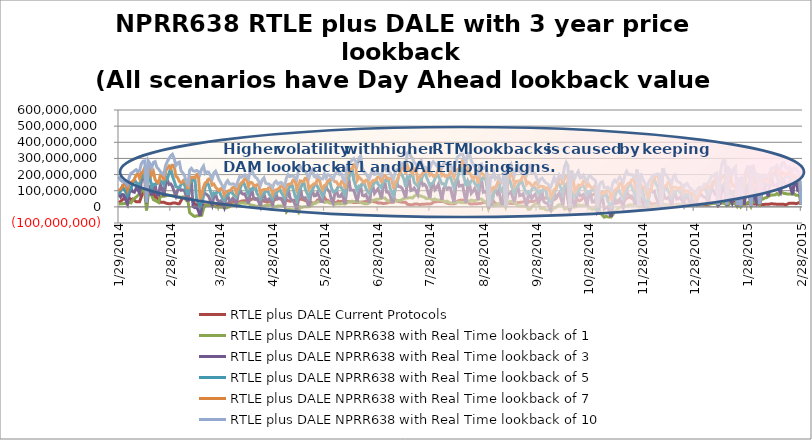
| Category | RTLE plus DALE Current Protocols | RTLE plus DALE NPRR638 with Real Time lookback of 1 | RTLE plus DALE NPRR638 with Real Time lookback of 3 | RTLE plus DALE NPRR638 with Real Time lookback of 5 | RTLE plus DALE NPRR638 with Real Time lookback of 7 | RTLE plus DALE NPRR638 with Real Time lookback of 10 |
|---|---|---|---|---|---|---|
| 1/29/14 | 26165652.225 | 17709287.253 | 76527592.9 | 76527592.9 | 101806723.448 | 188089786.375 |
| 1/30/14 | 33951592.112 | 18653802.654 | 61312578.058 | 97719446.167 | 109309679.373 | 165655656.982 |
| 1/31/14 | 43045783.01 | 18659278.401 | 76535131.416 | 125818531.343 | 125818531.343 | 157568515.088 |
| 2/1/14 | 54769080.035 | 20715354.196 | 74072259.88 | 110485111.069 | 141496596.19 | 160454626.414 |
| 2/2/14 | 54769080.035 | 19008503.449 | 41436894.702 | 92922000.17 | 136304542.49 | 147034414.108 |
| 2/3/14 | 54769080.035 | 17739152.64 | 17739152.64 | 69450591.695 | 104555443.125 | 134499430.953 |
| 2/4/14 | 54867904.896 | 26996020.267 | 86439733.595 | 99383187.698 | 146697169.046 | 183228840.895 |
| 2/5/14 | 44459964.79 | 24640817.867 | 113193286.391 | 113193286.391 | 151588242.612 | 207764552.472 |
| 2/6/14 | 48889341.468 | 41693185.982 | 94130071.633 | 146137356.395 | 157860503.523 | 213699274.897 |
| 2/7/14 | 39654347.796 | 50976492.36 | 90962221.877 | 169441738.78 | 169441738.78 | 223208714.813 |
| 2/8/14 | 32006154.249 | 60986309.439 | 114560262.93 | 150860091.411 | 196704959.607 | 230338929.282 |
| 2/9/14 | 32006154.249 | 71000199.81 | 108119589.093 | 140247632.815 | 208488368.895 | 218915800.982 |
| 2/10/14 | 32006154.249 | 85072667.007 | 85072667.007 | 140125780.146 | 176994774.496 | 223304887.273 |
| 2/11/14 | 63028979.82 | 100295642.93 | 158782564.051 | 183102307.407 | 209592567.887 | 266167044.328 |
| 2/12/14 | 85547610.904 | 105230691.051 | 183422167.297 | 183422167.297 | 217544858.153 | 282534156.366 |
| 2/13/14 | 85937272.747 | 87201054.15 | 178205704.075 | 226273932.53 | 245377253.608 | 284648077.673 |
| 2/14/14 | 97417042.342 | -22335133.928 | 22534531.316 | 28282402.028 | 28282402.028 | 29047897.517 |
| 2/15/14 | 109654336.546 | 84837511.407 | 131226220.664 | 213657866.2 | 257050555.52 | 285771771.665 |
| 2/16/14 | 109654336.546 | 79142358.955 | 102462712.479 | 186651220.536 | 249799873.317 | 267277767.718 |
| 2/17/14 | 109654336.546 | 70845363.688 | 70845363.688 | 116434067.223 | 198258303.201 | 240964313.82 |
| 2/18/14 | 84640835.996 | 44754554.29 | 125687111.653 | 140212324.171 | 218506688.552 | 275014636.427 |
| 2/19/14 | 60344140.354 | 39497830.886 | 137329698.341 | 137329698.341 | 168399234.777 | 279929560.01 |
| 2/20/14 | 56842811.04 | 33716680.02 | 74110660.754 | 143642216.904 | 155886347.871 | 245601132.791 |
| 2/21/14 | 42485541.507 | 27210426.427 | 72381414.646 | 150307200.859 | 150307200.859 | 233830278.512 |
| 2/22/14 | 29104966.55 | 63950706.037 | 136602765.839 | 163046621.836 | 197796989.606 | 218635904.587 |
| 2/23/14 | 29104966.55 | 66006563.571 | 113088367.193 | 152083500.633 | 198985782.158 | 208490308.816 |
| 2/24/14 | 29104966.55 | 66097541.981 | 66097541.981 | 138367962.208 | 164636623.605 | 199076760.569 |
| 2/25/14 | 23864162.506 | 66615520.105 | 139460698.059 | 184000649.46 | 220155639.303 | 253940640.898 |
| 2/26/14 | 21068769.319 | 73076635.477 | 170702604.297 | 170702604.297 | 238823744.066 | 279756654.55 |
| 2/27/14 | 19355877.946 | 71498645.075 | 138387855.373 | 207959124.748 | 252181724.337 | 297818695.257 |
| 2/28/14 | 18802534.063 | 70265512.929 | 141970338.429 | 237689915.909 | 237689915.909 | 316659409.717 |
| 3/1/14 | 23128178.094 | 69620016.794 | 127572795.629 | 190825734.451 | 257641267.301 | 325379782.884 |
| 3/2/14 | 23128178.094 | 67540550.28 | 94173003.259 | 162430371.131 | 255807288.342 | 299715739.648 |
| 3/3/14 | 23128178.094 | 67599775.887 | 67599775.887 | 125681001.986 | 188972353.953 | 255866513.949 |
| 3/4/14 | 19411967.958 | 59506239.3 | 102268470.472 | 120881425.753 | 181237604.015 | 271819591.803 |
| 3/5/14 | 19581333.766 | 61716591.477 | 119494683.443 | 119494683.443 | 158297652.82 | 277098895.521 |
| 3/6/14 | 38369816.469 | 56825881.012 | 102716789.31 | 137245499.368 | 148510825.665 | 223375424.219 |
| 3/7/14 | 57550185.653 | 62287524.069 | 104776584.4 | 155211900.196 | 155211900.196 | 210802070.934 |
| 3/8/14 | 56044264.844 | 61399121.606 | 100457782.079 | 138169468.996 | 167728597.58 | 194974462.755 |
| 3/9/14 | 56044264.844 | 40943787.641 | 66589721.18 | 100932791.755 | 147189641.505 | 156484855.25 |
| 3/10/14 | 56044264.844 | 34346102.833 | 34346102.833 | 73007319.416 | 110682996.29 | 140290128.221 |
| 3/11/14 | 50786282.858 | -36725406.366 | 138170038.726 | 157576173.432 | 185825476.361 | 227828474.122 |
| 3/12/14 | 52394012.107 | -45056064.166 | 154439556.633 | 154439556.633 | 182453392.453 | 238906748.071 |
| 3/13/14 | 35279158.185 | -54186648.793 | 1806001.055 | 165322085.999 | 183215743.042 | 223148540.477 |
| 3/14/14 | 16658128.226 | -59525980.209 | -4785017.409 | 178800425.434 | 178800425.434 | 220766094.933 |
| 3/15/14 | 13706829.115 | -55626885.368 | 752281.98 | 45993144.131 | 199907123.679 | 225595592.77 |
| 3/16/14 | 13706829.115 | -54914396.875 | -23352876.04 | 24442591.043 | 202411629.334 | 219681092.417 |
| 3/17/14 | 13706829.115 | -54515430.118 | -54515430.118 | 2152884.422 | 47609554.761 | 201942040.59 |
| 3/18/14 | 10367868.111 | -52120150.415 | 6893978.967 | 31165773.641 | 74864959.043 | 235799588.592 |
| 3/19/14 | 12220663.599 | -10489755.104 | 77079112.652 | 77079112.652 | 122149908.54 | 252311666.441 |
| 3/20/14 | 12280244.26 | 7612186.475 | 82279569.986 | 126019128.44 | 148501964.908 | 207872705.284 |
| 3/21/14 | 11383137.771 | 9667656.602 | 75029828.068 | 154005698.506 | 154005698.506 | 216808657.101 |
| 3/22/14 | 12942133.313 | 10197977.795 | 65097892.375 | 136037969.859 | 172565832.351 | 214758018.138 |
| 3/23/14 | 12942133.313 | 9415928.783 | 37198948.069 | 98559631.279 | 171922532.669 | 193856949.185 |
| 3/24/14 | 12942133.313 | 10306771.399 | 10306771.399 | 65005274.72 | 135727741.985 | 172020227.496 |
| 3/25/14 | 17287550.961 | 7951673.164 | 65743516.543 | 85271596.851 | 141466636.886 | 210590569.324 |
| 3/26/14 | 15207576.706 | -695451.679 | 80322476.802 | 80322476.802 | 121973953.85 | 221013794.862 |
| 3/27/14 | 14204179.027 | -2167802.253 | 43217076.489 | 91867917.872 | 109128098.31 | 196964317.214 |
| 3/28/14 | 14449424.791 | -2257131.787 | 32040724.402 | 101063262.087 | 101063262.087 | 168104644.16 |
| 3/29/14 | 14431130.416 | -2249915.25 | 37656015.951 | 73298294.922 | 112976472.07 | 149681145.141 |
| 3/30/14 | 14431130.416 | -2107816.994 | 24017470.034 | 52267865.848 | 113999293.812 | 130127791.245 |
| 3/31/14 | 14431130.416 | -2429372.655 | -2429372.655 | 37574138.475 | 73293761.794 | 113066408.11 |
| 4/1/14 | 16995874.674 | -7216112.673 | 54144901.013 | 69092521.741 | 93205535.065 | 148619336.899 |
| 4/2/14 | 21725595.053 | -2663014.959 | 72325660.717 | 72325660.717 | 97657850.535 | 162503626.7 |
| 4/3/14 | 21760578.006 | 810268.251 | 34747575.45 | 86741313.477 | 100802557.491 | 142203598.398 |
| 4/4/14 | 22200325.638 | 8103629.543 | 42311115.192 | 105261216.923 | 105261216.923 | 140432033.536 |
| 4/5/14 | 29239053.06 | 12354750.541 | 53578395.159 | 79785140.677 | 120216309.036 | 143063849.828 |
| 4/6/14 | 29239053.06 | 16156190.573 | 39773287.079 | 70062570.136 | 125626184.088 | 138499199.46 |
| 4/7/14 | 29239053.06 | 17447079.651 | 17447079.651 | 59624809.155 | 86509435.264 | 128026000.975 |
| 4/8/14 | 29183939.861 | 13020431.607 | 73802947.021 | 87520958.3 | 113023755.989 | 161166479.462 |
| 4/9/14 | 31253222.94 | 21090355.344 | 109766370.799 | 109766370.799 | 136825696.367 | 187199018.541 |
| 4/10/14 | 35731584.745 | 25100126.978 | 85081516.079 | 136978874.861 | 149311475.825 | 183666587.961 |
| 4/11/14 | 37383103.331 | 24028362.582 | 78716305.438 | 156844889.573 | 156844889.573 | 190645496.139 |
| 4/12/14 | 37762809.86 | 22619195.519 | 80539477.602 | 130005815.742 | 174422210.725 | 198268760.104 |
| 4/13/14 | 37762809.86 | 22228107.881 | 52184414.936 | 101320752.539 | 174031123.088 | 185703483.845 |
| 4/14/14 | 37762809.86 | 21509577.712 | 21509577.712 | 79284428.434 | 128575338.83 | 172857042.677 |
| 4/15/14 | 41320322.684 | 12317846.417 | 87307233.218 | 109408772.772 | 152330574.932 | 218002627.992 |
| 4/16/14 | 47764436.788 | 10545678.144 | 106169816.939 | 106169816.939 | 149833118.917 | 230115815.254 |
| 4/17/14 | 48480241.035 | 8824175.373 | 53170134.052 | 116367757.709 | 136543749.432 | 199784437.206 |
| 4/18/14 | 52261334.29 | 4723585.922 | 46033142.976 | 126649717.044 | 126649717.044 | 183891829.053 |
| 4/19/14 | 48076803.709 | 3898021.96 | 50033803.854 | 82694928.531 | 136855560.239 | 176202162.762 |
| 4/20/14 | 48076803.709 | 4643161.566 | 29724593.037 | 65728021.908 | 137600699.845 | 156583983.357 |
| 4/21/14 | 48076803.709 | 3191748.92 | 3191748.92 | 48786627.893 | 81092909.034 | 134618075.535 |
| 4/22/14 | 45342148.746 | 4479270.375 | 61546506.912 | 75198364.13 | 103266404.056 | 167284280.146 |
| 4/23/14 | 34456654.042 | 4988643.467 | 80794353.257 | 80794353.257 | 107360171.62 | 179573522.865 |
| 4/24/14 | 32702431.172 | 8400128.149 | 44676848.536 | 95516338.901 | 107741033.032 | 146624006.43 |
| 4/25/14 | 28520085.338 | 10891228.712 | 43218713.948 | 107485517.626 | 107485517.626 | 142189514.856 |
| 4/26/14 | 34704659.752 | 11628896.773 | 49693370.263 | 78350517.477 | 118847093.311 | 140837947.421 |
| 4/27/14 | 34704659.752 | 13041598.345 | 36721468.366 | 65166685.211 | 121272207.904 | 132858186.171 |
| 4/28/14 | 34704659.752 | 11942390.272 | 11942390.272 | 50169545.07 | 78861520.114 | 119501534.336 |
| 4/29/14 | 42270405.843 | 2435216.146 | 63101488.251 | 77581069.363 | 102655574.456 | 148299962.709 |
| 4/30/14 | 46844133.068 | 757639.154 | 79780175.024 | 79780175.024 | 104746566.014 | 158791953.417 |
| 5/1/14 | 52461928.948 | 6043356.687 | 49658953.662 | 98052612.638 | 109609888.771 | 141990933.019 |
| 5/2/14 | 50123324.586 | 5259661.795 | 53189134.627 | 116748649.985 | 116748649.985 | 148149864.018 |
| 5/3/14 | 47294111.154 | 5055766.404 | 52578451.623 | 89945201.389 | 130573262.32 | 151279723.346 |
| 5/4/14 | 47294111.154 | 3911174.375 | 29543457.714 | 72731483.776 | 129513658.911 | 140100812.504 |
| 5/5/14 | 47294111.154 | 5066290.633 | 5066290.633 | 52529050.299 | 89882133.461 | 130496202.134 |
| 5/6/14 | 43241075.89 | -30730432.16 | 70857977.447 | 89308669.666 | 127805495.637 | 179107591.782 |
| 5/7/14 | 38024569.058 | -16526926.124 | 105789641.015 | 105789641.015 | 138933952.739 | 199342525.967 |
| 5/8/14 | 34800096.191 | -16640708.731 | 57702106.647 | 126431080.173 | 141197747.145 | 187656260.995 |
| 5/9/14 | 36025740.274 | -18322878.452 | 40989995.989 | 145049734.484 | 145049734.484 | 189593761.732 |
| 5/10/14 | 39347436.698 | -18230350.265 | 41551340.672 | 108205325.104 | 166867793.687 | 193588457.125 |
| 5/11/14 | 39347436.698 | -18413458.145 | 12809326.5 | 67752495.318 | 167769072.093 | 180913026.189 |
| 5/12/14 | 39347436.698 | -18651171.929 | -18651171.929 | 41602588.001 | 108794886.89 | 167736586.671 |
| 5/13/14 | 41773531.356 | -32947594.065 | 62549217.027 | 86872978.226 | 135795750.559 | 225917197.155 |
| 5/14/14 | 48505784.744 | 736846.479 | 114721773.886 | 114721773.886 | 161001835.466 | 249660066.468 |
| 5/15/14 | 45934095.2 | -3580214.362 | 60324786.681 | 135966813.825 | 157944106.849 | 238231273.221 |
| 5/16/14 | 43115859.464 | 19196.734 | 55388043.958 | 157019689.59 | 157019689.59 | 221438565.277 |
| 5/17/14 | 37879502.938 | 552686.49 | 56132615.311 | 108775459.537 | 177611433.242 | 219549295.271 |
| 5/18/14 | 37879502.938 | 1240619.63 | 31141845.936 | 83264079.751 | 179254194.845 | 200136582.238 |
| 5/19/14 | 37879502.938 | 819207.394 | 819207.394 | 56727890.381 | 109630490.25 | 178823125.46 |
| 5/20/14 | 31479478.931 | 4795773.024 | 73368240.518 | 90667965.33 | 126954019.062 | 213990099.393 |
| 5/21/14 | 21917221.765 | 13318105.259 | 102598514.156 | 102598514.156 | 133126282.871 | 229815012.472 |
| 5/22/14 | 23149774.758 | 23652638.597 | 68407813.674 | 128990528.079 | 142757902.544 | 189384290.66 |
| 5/23/14 | 27018629.19 | 22380768.795 | 69622764.089 | 143643244.34 | 143643244.34 | 182955418.589 |
| 5/24/14 | 41753703.106 | 32000262.019 | 88236519.524 | 125761932.004 | 170310830.37 | 195950136.464 |
| 5/25/14 | 41753703.106 | 31828215.447 | 63439831.218 | 105777996.215 | 170706524.801 | 183192992.89 |
| 5/26/14 | 41753703.106 | 33654634.435 | 33654634.435 | 90529808.957 | 128599889.814 | 173822189.429 |
| 5/27/14 | 45655421.223 | 33135778.975 | 33135778.975 | 65008670.072 | 107667929.096 | 173275157.39 |
| 5/28/14 | 60459345.103 | 27437299.469 | 95294492.627 | 95294492.627 | 132475764.015 | 202637457.151 |
| 5/29/14 | 40733572.672 | 29490366.618 | 120615512.512 | 120615512.512 | 137303591.158 | 178553927.812 |
| 5/30/14 | 40432535.228 | 31104328.733 | 104698442.068 | 158602430.52 | 158602430.52 | 199265178.425 |
| 5/31/14 | 27420726.578 | 23383041.09 | 93173648.125 | 167477242.853 | 167477242.853 | 196083262.464 |
| 6/1/14 | 27420726.578 | 22378971.042 | 46574652.862 | 117892258.808 | 168929532.915 | 183627807.213 |
| 6/2/14 | 27420726.578 | 22876431.412 | 22876431.412 | 93537383.168 | 169317685.471 | 169317685.471 |
| 6/3/14 | 27652186.316 | 15731415.921 | 81495977.265 | 96503284.779 | 156463058.133 | 200653068.367 |
| 6/4/14 | 27080747.919 | 17978048.751 | 102841468.109 | 102841468.109 | 154560382.439 | 214428370.252 |
| 6/5/14 | 35976375.944 | 20056132.018 | 65652103.904 | 122451907.866 | 136126855.268 | 228506744.902 |
| 6/6/14 | 32569559.521 | 17293404.487 | 64616454.361 | 133425668.573 | 133425668.573 | 199823654.967 |
| 6/7/14 | 34048554.466 | 21094428.159 | 79120643.942 | 115896432.077 | 158016902.67 | 201959983.769 |
| 6/8/14 | 34048554.466 | 18576276.731 | 53290570.261 | 95629479.066 | 157428652.491 | 169185577.167 |
| 6/9/14 | 34048554.466 | 18163614.106 | 18163614.106 | 77598967.657 | 115219937.818 | 158247001.702 |
| 6/10/14 | 34307735.552 | 25447723.563 | 135143373.71 | 159846828.243 | 192481540.402 | 244000554.755 |
| 6/11/14 | 31458153.385 | 29837870.359 | 174855137.804 | 174855137.804 | 215038923.595 | 277186489.339 |
| 6/12/14 | 31697789.311 | 30613146.642 | 104556588.515 | 207120489.831 | 230957253.784 | 276171023.84 |
| 6/13/14 | 29940017.488 | 34955696.051 | 104110535.503 | 237477962.232 | 237477962.232 | 289743561.967 |
| 6/14/14 | 26652265.383 | 33452625.435 | 101899110.669 | 167242198.455 | 261800163.225 | 298910448.317 |
| 6/15/14 | 26652265.383 | 32536023.883 | 67711609.303 | 132225038.571 | 259309864.703 | 282124596.313 |
| 6/16/14 | 26652265.383 | 32151263.751 | 32151263.751 | 100128490.368 | 165063246.655 | 259066083.442 |
| 6/17/14 | 26459191.366 | 30411789.193 | 104414755.015 | 129159815.855 | 184097416.131 | 303842598.641 |
| 6/18/14 | 28881956.705 | 27015547.389 | 125907763.829 | 125907763.829 | 173950463.282 | 315869419.875 |
| 6/19/14 | 30255623.928 | 23820488.382 | 71518038.373 | 139288464.38 | 161578776.76 | 237340677.742 |
| 6/20/14 | 30840644.322 | 20109188.123 | 67744831.417 | 149336490.148 | 149336490.148 | 216904266.546 |
| 6/21/14 | 35189758.46 | 18404988.471 | 76110872.782 | 114822150.932 | 164741721.565 | 206698374.601 |
| 6/22/14 | 35189758.46 | 19759384.883 | 51302241.285 | 94089745.557 | 166822570.915 | 187315418.004 |
| 6/23/14 | 35189758.46 | 24891289.016 | 24891289.016 | 83611649.915 | 122857091.72 | 173492370.632 |
| 6/24/14 | 39439469.087 | 33466688.145 | 104812852.978 | 122088619.35 | 147346244.709 | 208208749.173 |
| 6/25/14 | 32973110.16 | 40485598.248 | 132586159.279 | 132586159.279 | 161888761.262 | 228534194.655 |
| 6/26/14 | 31027085.966 | 41881046.042 | 83118813.556 | 148794138.842 | 164171082.663 | 201264658.443 |
| 6/27/14 | 29344690.16 | 46407303.251 | 97502300.109 | 168060605.391 | 168060605.391 | 203724157.779 |
| 6/28/14 | 23544131 | 46528492.504 | 111915978.573 | 141149323.407 | 184685308.191 | 209582003.536 |
| 6/29/14 | 23544131 | 49706773.158 | 85558405.783 | 130783469.356 | 187728988.341 | 200996262.858 |
| 6/30/14 | 23544131 | 52229406.861 | 52229406.861 | 118347083.255 | 147870967.706 | 191827648.361 |
| 7/1/14 | 20291486.335 | 56056943.202 | 135724085.968 | 155351250.779 | 189036620.67 | 233288720.557 |
| 7/2/14 | 22193605.985 | 54921734.361 | 157004590.925 | 157004590.925 | 194440740.215 | 247826132.709 |
| 7/3/14 | 23245175.547 | 42709386.189 | 91284426.091 | 164027529.629 | 182626829.619 | 222467769.009 |
| 7/4/14 | 28023459.45 | 35852627.95 | 90873349.801 | 172643963.453 | 172643963.453 | 220258355.156 |
| 7/5/14 | 28637179.076 | 38613368.197 | 71181806.799 | 115793149.215 | 175925411.04 | 211167783.701 |
| 7/6/14 | 28637179.076 | 34897893.331 | 34897893.331 | 90085133.705 | 171999024.502 | 190281589.698 |
| 7/7/14 | 28637179.076 | 35137646.803 | 35137646.803 | 67596692.059 | 111984629.505 | 171895887.154 |
| 7/8/14 | 44730073.562 | 37420488.751 | 115271936.622 | 115271936.622 | 151673177.48 | 213629446.832 |
| 7/9/14 | 35456377.728 | 39348197.256 | 144011825.287 | 144011825.287 | 162785087.995 | 231245053.644 |
| 7/10/14 | 32811614.724 | 39627984.812 | 125716928.17 | 190086329.807 | 190086329.807 | 234931114.402 |
| 7/11/14 | 30887361.04 | 38274330.391 | 124249891.702 | 213926118.975 | 213926118.975 | 247006803.528 |
| 7/12/14 | 28572094.228 | 46720998.688 | 115377173.139 | 194544639.857 | 250796249.147 | 267442637.277 |
| 7/13/14 | 28572094.228 | 51214639.699 | 88564914.858 | 172475016.23 | 255780999.503 | 255780999.503 |
| 7/14/14 | 28572094.228 | 55089855.537 | 55089855.537 | 124929184.418 | 205499691.835 | 262936202.213 |
| 7/15/14 | 15936132.677 | 53945513.98 | 157836904.195 | 185331712.817 | 258364924.975 | 329794613.103 |
| 7/16/14 | 14104326.105 | 57020746.163 | 178841217.515 | 178841217.515 | 227974531.421 | 344352781.861 |
| 7/17/14 | 13319048.195 | 56984185.008 | 100724354.753 | 193643354.06 | 219891785.354 | 314007407.235 |
| 7/18/14 | 12719494.979 | 54748801.173 | 103766054.811 | 205652974.957 | 205652974.957 | 300180838.059 |
| 7/19/14 | 17189810.102 | 66025285.35 | 116357876.931 | 151272989.783 | 229996507.683 | 275436813.144 |
| 7/20/14 | 17189810.102 | 72285193.083 | 98523612.852 | 140732334.327 | 240064257.469 | 264992590.773 |
| 7/21/14 | 17189810.102 | 76455072.587 | 76455072.587 | 127601044.678 | 163079805.63 | 242760082.206 |
| 7/22/14 | 14136580.808 | 67379638.378 | 139335154.165 | 158442702.427 | 183354529.657 | 273410281.726 |
| 7/23/14 | 15343458.257 | 67277612.889 | 166718094.983 | 166718094.983 | 191779338.003 | 287146587.621 |
| 7/24/14 | 15669750.178 | 62301362.027 | 133533251.404 | 195583901.951 | 210108635.851 | 241831234.319 |
| 7/25/14 | 16738140.67 | 59740903.692 | 139416236.664 | 217140790.871 | 217140790.871 | 245973726.387 |
| 7/26/14 | 17435055.202 | 50305984.765 | 125645449.52 | 186765125.593 | 222677576.047 | 241135659.914 |
| 7/27/14 | 17435055.202 | 51673866.025 | 88429821.939 | 161250578.443 | 224045457.307 | 236657687.017 |
| 7/28/14 | 17435055.202 | 55428128.148 | 55428128.148 | 132978613.542 | 196070242.989 | 232861301.289 |
| 7/29/14 | 19934047.529 | 46567285.658 | 124761159.515 | 144694305.116 | 205549306.917 | 267024232.774 |
| 7/30/14 | 28658407.342 | 44451967.694 | 146036833.247 | 146036833.247 | 189265172.114 | 279812774.677 |
| 7/31/14 | 30651584.55 | 49201131.544 | 105620536.452 | 174631884.226 | 191458980.715 | 269072427.543 |
| 8/1/14 | 32682900.11 | 41708442.895 | 118345337.991 | 200942060.703 | 200942060.703 | 253879532.369 |
| 8/2/14 | 33434043.259 | 42132304.657 | 139923404.643 | 190377978.612 | 236408835.244 | 263688218.152 |
| 8/3/14 | 33434043.259 | 41403349.294 | 92704557.747 | 166283325.565 | 237030624.661 | 251327720.496 |
| 8/4/14 | 33434043.259 | 43501021.639 | 43501021.639 | 143193381.263 | 194595177.874 | 241310901.544 |
| 8/5/14 | 34687473.314 | 36520276.802 | 112936416.952 | 143126954.41 | 201853898.539 | 267661685.339 |
| 8/6/14 | 26485753.544 | 28573415.623 | 129711287.9 | 129711287.9 | 187862203.225 | 272921730.126 |
| 8/7/14 | 23529254.53 | 35436893.277 | 110683028.458 | 168078518.242 | 191505065.734 | 264602699.331 |
| 8/8/14 | 20040978.708 | 28537110.356 | 118292977.308 | 194630275.392 | 194630275.392 | 264802741.383 |
| 8/9/14 | 19000665.71 | 23109402.341 | 116182650.005 | 183060585.755 | 218288226.645 | 264721109.357 |
| 8/10/14 | 19000665.71 | 24852033.594 | 68281829.641 | 150714487.726 | 212078258.503 | 230498072.562 |
| 8/11/14 | 19000665.71 | 28974305.422 | 28974305.422 | 118324806.53 | 182318379.549 | 216200530.331 |
| 8/12/14 | 21273019.686 | 25148776.825 | 131286598.918 | 158674748.146 | 225119067.509 | 272428042.219 |
| 8/13/14 | 35032331.561 | 28779074.667 | 174579188.358 | 174579188.358 | 231065296.842 | 308153693.286 |
| 8/14/14 | 39657464.93 | 30235333.375 | 128043808.969 | 217503686.265 | 238945685.459 | 317773102.315 |
| 8/15/14 | 41880532.165 | 27215998.021 | 131796770.484 | 254041606.98 | 254041606.98 | 327476504.679 |
| 8/16/14 | 40803351.468 | 25866369.074 | 134500558.193 | 218558959.421 | 285811193.281 | 326038258.16 |
| 8/17/14 | 40803351.468 | 27620050.442 | 80469514.386 | 175460626.795 | 279554006.623 | 296087084.592 |
| 8/18/14 | 40803351.468 | 25101638.442 | 25101638.442 | 127845269.554 | 207552016.989 | 271573503.687 |
| 8/19/14 | 35701332.087 | 33083725.714 | 126998018.25 | 162671765.984 | 239043566.942 | 329758309.046 |
| 8/20/14 | 19854256.232 | 36994486.845 | 141289975.679 | 141289975.679 | 212078022.461 | 331127920.586 |
| 8/21/14 | 17446721.223 | 41575314.614 | 83345510.213 | 158434859.845 | 189861132.71 | 286196936.65 |
| 8/22/14 | 18451911.239 | 39749271.791 | 96066847.905 | 172072914.809 | 172072914.809 | 267566089.404 |
| 8/23/14 | 19963864.957 | 37006738.994 | 113829333.792 | 144743245.949 | 189066017.174 | 248454964.261 |
| 8/24/14 | 19963864.957 | 41970854.551 | 87011664.939 | 135554061.791 | 191153370.864 | 217834992.592 |
| 8/25/14 | 19963864.957 | 43474287.421 | 43474287.421 | 117109115.281 | 146733984.178 | 189046019.189 |
| 8/26/14 | 20358836.479 | 49509154.229 | 152805593.933 | 181262561.948 | 215987650.77 | 256737530.366 |
| 8/27/14 | 23270172.216 | 48016613.874 | 168182697.128 | 168182697.128 | 212083435.137 | 264332271.85 |
| 8/28/14 | 27699277.157 | 37713659.82 | 90129506.558 | 176036795.775 | 199725246.721 | 236978648.569 |
| 8/29/14 | 26761396.342 | 33641152.442 | 93777406.677 | 190940071.277 | 190940071.277 | 243084396.795 |
| 8/30/14 | 28039537.064 | 23913335.41 | 85079759.02 | 130248598.81 | 194821038.486 | 231611583.036 |
| 8/31/14 | 28039537.064 | -12096073.865 | -9096346.004 | -782186.21 | 5746864.731 | 6648949.14 |
| 9/1/14 | 28039537.16 | 16857299.99 | 16857299.99 | 76905018.914 | 121410058.232 | 184966057.06 |
| 9/2/14 | 29805546.02 | 16639115.558 | 16639115.558 | 44963385.61 | 99247995.93 | 181829392.568 |
| 9/3/14 | 33834025.24 | 5794161.638 | 86254090.69 | 86254090.69 | 121072839.88 | 212857315.316 |
| 9/4/14 | 20297749.21 | 10526850.79 | 103548376.93 | 103548376.93 | 117769710.688 | 173203767.413 |
| 9/5/14 | 18289222.64 | 13507016.519 | 81332159.082 | 139308519.339 | 139308519.339 | 182802172.336 |
| 9/6/14 | 17543270.52 | 21421758.77 | 104673592.465 | 164599344.877 | 164599344.877 | 190310705.33 |
| 9/7/14 | 17543270.52 | 11152213.735 | 41495348.986 | 103050785.982 | 148763172.786 | 159453830.609 |
| 9/8/14 | 17543270.52 | 11386238.506 | 11386238.506 | 91184949.6 | 149217057.158 | 149217057.158 |
| 9/9/14 | 20438135.01 | 30725005.605 | 103557324.608 | 127858927.829 | 181354984.82 | 214859336.493 |
| 9/10/14 | 20874846.85 | -1021706.613 | 531063.857 | 531063.857 | 626636.428 | 1496530.183 |
| 9/11/14 | 21959932.71 | 29141927.613 | 86331337.732 | 155337488.432 | 178768784.008 | 253612813.886 |
| 9/12/14 | 21584530.54 | 30924758.03 | 83358613.937 | 178157808.118 | 178157808.118 | 249190070.379 |
| 9/13/14 | 20775752.43 | 35188327.474 | 90262535.83 | 140419126.987 | 203606228.833 | 265392646.417 |
| 9/14/14 | 20775752.43 | 31989729 | 60247225.111 | 109075219.049 | 198051392.813 | 220390523.323 |
| 9/15/14 | 20775752.43 | 30541096.195 | 30541096.195 | 84482055.509 | 133488789.952 | 195469914.157 |
| 9/16/14 | 23329629.79 | 16763623.455 | 103059415.164 | 118327071.919 | 157336324.959 | 234770312.041 |
| 9/17/14 | 26588089.57 | 7004368.179 | 126568286.101 | 126568286.101 | 159051962.29 | 253796839.025 |
| 9/18/14 | 27303352.99 | 4412267.718 | 69233982.184 | 145566270.166 | 159868194.726 | 219238682.277 |
| 9/19/14 | 29173970.41 | 5284529.589 | 71710581.475 | 168145130.144 | 168145130.144 | 216933581.066 |
| 9/20/14 | 29711451.86 | 4125799.262 | 80571628.682 | 134449607.787 | 191063494.111 | 220184252.092 |
| 9/21/14 | 29711451.86 | 4098646.978 | 43477833.028 | 106862817.048 | 193565628.227 | 207125751.045 |
| 9/22/14 | 29711451.86 | 5475196.237 | 5475196.237 | 84328635.445 | 139563342.337 | 197480919.761 |
| 9/23/14 | 30462955.64 | -15115886.912 | 65078516.239 | 93944934.211 | 152129813.547 | 237050908.013 |
| 9/24/14 | 32942502.9 | -14613896.803 | 85891649.372 | 85891649.372 | 146674774.749 | 251021000.185 |
| 9/25/14 | 32749126.57 | -1299213.866 | 49595597.512 | 104773304.29 | 131184472.686 | 210759058.696 |
| 9/26/14 | 32830928.23 | 9526142.386 | 67719037.266 | 129799225.889 | 129799225.889 | 209223885.478 |
| 9/27/14 | 38007422.47 | 16156668.947 | 77983334.055 | 117780289.262 | 150092314.055 | 205627785.568 |
| 9/28/14 | 38007422.47 | 18511891.595 | 50830035.513 | 98377458.806 | 150650129.915 | 175044992.105 |
| 9/29/14 | 38007422.47 | 20160742.646 | 20160742.646 | 79904500.242 | 118533200.41 | 149830701.971 |
| 9/30/14 | 44115170.49 | -8553454.914 | 80095149.107 | 99271522.496 | 128603598.13 | 170676107.298 |
| 10/1/14 | 50636279.98 | -9772813.19 | 95797718.101 | 95797718.101 | 126717145.691 | 178482363.41 |
| 10/2/14 | 53176920.19 | -7335042.368 | 33331641.749 | 109077326.577 | 124832510.91 | 164417265.697 |
| 10/3/14 | 55609719.16 | -16951500.029 | 23415693.34 | 111235373.135 | 111235373.135 | 150260889.262 |
| 10/4/14 | 51951274.04 | -19609678.364 | 24760294.891 | 59510133.149 | 118780880.331 | 144712701.106 |
| 10/5/14 | 51951274.04 | -19546412.275 | 1901016.756 | 39418233.4 | 119146300.999 | 133105741.047 |
| 10/6/14 | 51951274.04 | -18369815.883 | -18369815.883 | 26890050.163 | 62103642.745 | 121871111.331 |
| 10/7/14 | 49003616.39 | -19801126.421 | 37100606.463 | 48677104.014 | 77390728.647 | 150236432.206 |
| 10/8/14 | 44781022.18 | -5048119.96 | 82311126.802 | 82311126.802 | 106735092.139 | 181478647.323 |
| 10/9/14 | 49819481.04 | -4799898.292 | 58924104.213 | 105988647.514 | 114436197.829 | 151181119.864 |
| 10/10/14 | 66693516.1 | 7546008.353 | 73300374.198 | 144464452.943 | 144464452.943 | 172618807.531 |
| 10/11/14 | 78328371.66 | 13618391.481 | 85894682.538 | 141365989.22 | 180840563.258 | 199145396.029 |
| 10/12/14 | 78328371.66 | 13572714.257 | 49033287.144 | 112585466.663 | 179997522.403 | 187629981.656 |
| 10/13/14 | 78328371.66 | 11213580.772 | 11213580.772 | 82325379.177 | 136824840.873 | 175479488.569 |
| 10/14/14 | 89884609.41 | -13610651.89 | 108394840.448 | 133860856.098 | 186231979.2 | 248026007.186 |
| 10/15/14 | 107590362.39 | -10501364.334 | 138536521.739 | 138536521.739 | 190519706.757 | 275191248.443 |
| 10/16/14 | 106587412.84 | -4658251.216 | 43271302.046 | 154254203.919 | 178535151.309 | 254228437.128 |
| 10/17/14 | 85130927.04 | -25331273.284 | -24367382.529 | -5999443.535 | -5999443.535 | -4545761.604 |
| 10/18/14 | 70074284.39 | -2413031.536 | 62058578.086 | 95315589.725 | 176370127.05 | 224367652.364 |
| 10/19/14 | 70074284.39 | -2849446.268 | 29258165.908 | 75477682.224 | 175757115.4 | 198916331.136 |
| 10/20/14 | 70074284.39 | -1125430.963 | -1125430.963 | 63237541.886 | 96466423.723 | 177321870.615 |
| 10/21/14 | 53144116.22 | 2422178.914 | 61650836.219 | 78897104.086 | 115100770.063 | 202540640.542 |
| 10/22/14 | 38679585.33 | 14003312.12 | 95827092.245 | 95827092.245 | 135042978.38 | 218944968.524 |
| 10/23/14 | 37833720.82 | 6994373.222 | 68134497.853 | 117942756.473 | 132593894.243 | 178585589.482 |
| 10/24/14 | 46890201.03 | 8569787.332 | 71209281.234 | 134928578.615 | 134928578.615 | 180061662.646 |
| 10/25/14 | 59496065.05 | 10890847.909 | 77713598.721 | 129307766.022 | 160286131.732 | 195556198.699 |
| 10/26/14 | 59496065.05 | 11196245.022 | 46889809.43 | 106009698.867 | 160013379.402 | 172961948.482 |
| 10/27/14 | 59496065.05 | 9494422.508 | 9494422.508 | 75751645.908 | 126943328.337 | 157547427.867 |
| 10/28/14 | 64044407.45 | -844687.306 | 79219873.964 | 94253804.836 | 139983324.224 | 187860894.209 |
| 10/29/14 | 73130038.18 | -10218249.492 | 93058134.266 | 93058134.266 | 124758237.093 | 195558523.35 |
| 10/30/14 | 74454102.68 | -15727306.14 | 30053541.354 | 104741409.493 | 117462164.775 | 177273896.647 |
| 10/31/14 | 77399479.64 | -14668453.634 | 30918687.532 | 119354285.639 | 119354285.639 | 170199365.203 |
| 11/1/14 | 78834628.62 | -4119657.344 | 46967001.393 | 78210765.784 | 132418857.516 | 159915082.057 |
| 11/2/14 | 78834628.62 | -28985728.538 | -27528452.841 | -25924296.785 | -5093472.418 | -4508591.621 |
| 11/3/14 | 78834628.62 | -5329457.859 | -5329457.859 | 45605262.942 | 76767838.542 | 130730570.338 |
| 11/4/14 | 83504454.25 | -41795626.283 | 50702522.059 | 62412478.885 | 85803660.998 | 150348090.638 |
| 11/5/14 | 88864611.37 | -52514917.297 | 61847791.837 | 61847791.837 | 84756922.812 | 154995997.019 |
| 11/6/14 | 81914369.86 | -63731795.488 | -13811036.832 | 72618956.859 | 83098053.39 | 119059920.149 |
| 11/7/14 | 71813118.15 | -58936212.72 | -5182676.189 | 90971456.881 | 90971456.881 | 119610738.603 |
| 11/8/14 | 57776478.26 | -61762729.924 | 426960.31 | 37612227.298 | 103637800.284 | 122125029.582 |
| 11/9/14 | 57776478.26 | -62668571.914 | -30563120.335 | 17078657.929 | 101852900.759 | 110885977.333 |
| 11/10/14 | 57776478.26 | -62562870.291 | -62562870.291 | -848306.348 | 36129367.849 | 101958602.383 |
| 11/11/14 | 46425368.01 | -48067482.559 | 23303046.168 | 46278725.308 | 83430027.114 | 149385816.446 |
| 11/12/14 | 22696187.27 | -31381167.512 | 59110533.22 | 59110533.22 | 103493639.343 | 164855936.658 |
| 11/13/14 | 22982070.41 | -20756615.591 | 26829102.546 | 89160533.184 | 109884642.821 | 151769605.932 |
| 11/14/14 | 24374422.09 | -11081099.829 | 37678048.82 | 116686348.195 | 116686348.195 | 168796119.955 |
| 11/15/14 | 32116949.43 | -2051625.627 | 48546156.923 | 89491872.303 | 145114510.879 | 185703943.396 |
| 11/16/14 | 32116949.43 | -853635.006 | 25270262.743 | 72332820.147 | 149160411.769 | 169423924.621 |
| 11/17/14 | 32116949.43 | -1549708.643 | -1549708.643 | 51807264.856 | 94958244.969 | 153579735.524 |
| 11/18/14 | 41356718.24 | 4127921.043 | 65675134.056 | 83450889.053 | 124173218.978 | 196543507.142 |
| 11/19/14 | 53598448.94 | 3301936.527 | 97389168.201 | 97389168.201 | 132933523.11 | 220138796.79 |
| 11/20/14 | 57338693.02 | 11180541.738 | 72817034.803 | 129506939.183 | 145781513.738 | 200115518.435 |
| 11/21/14 | 59629711.3 | 12550982.903 | 66611143.278 | 148684944.824 | 148684944.824 | 199559157.581 |
| 11/22/14 | 51811668.13 | 12135509.82 | 67340996.135 | 122308289.185 | 168143708.54 | 200187099.173 |
| 11/23/14 | 51811668.13 | 13951407.822 | 44016450.003 | 94217079.895 | 171726849.135 | 186752499.332 |
| 11/24/14 | 51811668.13 | 14091426.983 | 14091426.983 | 69900613.068 | 125539279.411 | 171980206.462 |
| 11/25/14 | 44718957.52 | 17497918.808 | 97703085.528 | 117701191.391 | 158693920.541 | 231729358.287 |
| 11/26/14 | 36637578.51 | -1309821.955 | 4285867.963 | 4285867.963 | 4735338.913 | 9368030.216 |
| 11/27/14 | 32763178.14 | 3182788.023 | 57444137.518 | 123826218.988 | 142569550.375 | 208100909.66 |
| 11/28/14 | 29474253.96 | 2394134.935 | 36626155.399 | 122475915.592 | 122475915.592 | 178620693.797 |
| 11/29/14 | 31232863.93 | 2632613.451 | 2632613.451 | 56011552.848 | 121280853.597 | 157100060.719 |
| 11/30/14 | 31232863.93 | 2972971.394 | 2972971.394 | 36282217.138 | 119399800.291 | 137468744.045 |
| 12/1/14 | 31232863.93 | 981524.353 | 981524.353 | 981524.353 | 53516552.177 | 117434764.206 |
| 12/2/14 | 30465102.92 | 1285559.362 | 80246102.495 | 80246102.495 | 106699435.715 | 159013213.576 |
| 12/3/14 | 19890836.48 | 2034317.769 | 99618158.695 | 99618158.695 | 99618158.695 | 173642333.02 |
| 12/4/14 | 17792648.05 | -28235.157 | 92273960.059 | 158153121.738 | 158153121.738 | 195170515.408 |
| 12/5/14 | 19891799.14 | 3100973.303 | 96946509.852 | 176304551.965 | 176304551.965 | 196047080.067 |
| 12/6/14 | 20229600.13 | 9554126.147 | 56499827.056 | 139635844.957 | 201068800.567 | 201068800.567 |
| 12/7/14 | 20229600.13 | 9608160.025 | 33967004.918 | 124773907.279 | 201831657.514 | 201831657.514 |
| 12/8/14 | 20229600.13 | 10656199.06 | 10656199.06 | 57345743.692 | 140371028.631 | 201947146.492 |
| 12/9/14 | 16281555.83 | 2574276.18 | 5841774.69 | 6265724.215 | 6978205.044 | 7807977.276 |
| 12/10/14 | 15645638.84 | 10582443.373 | 96579653.069 | 96579653.069 | 124783230.096 | 239735135.784 |
| 12/11/14 | 13897471.27 | 10573752.232 | 54784055.611 | 114322188.174 | 128696497.946 | 199882700.34 |
| 12/12/14 | 11800151.71 | 11253598.792 | 51405921.495 | 129529433.327 | 129529433.327 | 199199832.668 |
| 12/13/14 | 10650307.45 | 11531040.742 | 58516966.068 | 96148606.505 | 150969706.928 | 175699157.969 |
| 12/14/14 | 10650307.45 | 11630465.707 | 40054679.273 | 76950261.13 | 150436150.422 | 163479518.369 |
| 12/15/14 | 10650307.45 | 10468754.347 | 10468754.347 | 56426149.925 | 93323984.949 | 147027477.865 |
| 12/16/14 | 11368333.1 | 13046087.817 | 72938470.49 | 92515505.848 | 122073569.439 | 186553741.152 |
| 12/17/14 | 10115992.01 | 14502539.676 | 88047993.424 | 88047993.424 | 120861813.138 | 197118699.095 |
| 12/18/14 | 11181598.8 | 15983729.533 | 48032076.308 | 100028717.405 | 117938656.184 | 161323661.04 |
| 12/19/14 | 11737127.7 | 16698740.902 | 51711903.29 | 109910388.483 | 109910388.483 | 153729654.16 |
| 12/20/14 | 12921023.44 | 15526360.702 | 59231152.967 | 86934031.873 | 121194547.003 | 148468548.81 |
| 12/21/14 | 12921023.44 | 15451152.044 | 39503690.719 | 72073834.379 | 121119338.345 | 136045287.282 |
| 12/22/14 | 12921023.44 | 13216155.813 | 13216155.813 | 56920948.079 | 84623826.984 | 118884342.115 |
| 12/23/14 | 13333802.13 | 15419124.001 | 63301795.094 | 76548787.752 | 99588825.909 | 140311025.217 |
| 12/24/14 | 17975328.01 | 14718471.011 | 71776817.014 | 71776817.014 | 97080693.201 | 145466690.172 |
| 12/25/14 | 18688327.84 | 14913062.17 | 39380334.9 | 80841344.429 | 92530419.307 | 123658911.17 |
| 12/26/14 | 19400489.11 | 15912259.171 | 29414129.709 | 81508049.785 | 81508049.785 | 113729438.375 |
| 12/27/14 | 19986631.96 | 15533634.624 | 15533634.624 | 39787735.832 | 80842010.552 | 104234712.83 |
| 12/28/14 | 19986631.96 | 15366527.159 | 15366527.159 | 28925063.481 | 81248663.821 | 92827291.168 |
| 12/29/14 | 19986631.96 | 16217342.459 | 16217342.459 | 16217342.459 | 40886209.727 | 82685201.823 |
| 12/30/14 | 20043766.97 | 16223873.87 | 55343678.826 | 55343678.826 | 66810880.116 | 108130444.264 |
| 12/31/14 | 16287426.01 | 16369917.238 | 71665892.942 | 71665892.942 | 71665892.942 | 122124238.053 |
| 1/1/15 | 15897502.53 | 17211025.723 | 78179350.044 | 105677077.095 | 105677077.095 | 122017382.169 |
| 1/2/15 | 15829086.5 | 17071874.594 | 66397030.055 | 107262167.052 | 107262167.052 | 116470377.315 |
| 1/3/15 | 15318898.95 | 18243656.694 | 59004334.204 | 113448362.433 | 139871765.947 | 139871765.947 |
| 1/4/15 | 15318898.95 | 18162394.424 | 58913269.06 | 102304541.981 | 139677747.544 | 139677747.544 |
| 1/5/15 | 15318898.95 | 19416097.764 | 19416097.764 | 60669303.638 | 115687793.863 | 142390991.497 |
| 1/6/15 | 17448254.14 | 19950233.702 | 64913417.198 | 88549831.245 | 124805151.18 | 158893143.791 |
| 1/7/15 | 21514504.58 | 19752032.109 | 111029558.923 | 111029558.923 | 130888935.558 | 190464331.735 |
| 1/8/15 | 26048694.56 | 22411344.564 | 104175511.163 | 137289265.964 | 156272154.049 | 189845022.963 |
| 1/9/15 | 24949922.73 | 21920889.607 | 79304272.951 | 161509358.389 | 161509358.389 | 202119436.471 |
| 1/10/15 | 26566373.49 | 20460284.439 | 82121260.751 | 159951208.164 | 190211403.907 | 208174627.915 |
| 1/11/15 | 26566373.49 | 8057645.065 | 10976593.297 | 11709830.371 | 13341211.775 | 14138943.639 |
| 1/12/15 | 26566373.49 | 21170734.684 | 21170734.684 | 83233455.937 | 161581593.974 | 192037351.071 |
| 1/13/15 | 30341355.21 | 21726241.433 | 99352186.375 | 129997911.753 | 180761576.357 | 259394117.98 |
| 1/14/15 | 30440831.94 | 23307770.515 | 134798818.8 | 134798818.8 | 189946664.564 | 292858125.64 |
| 1/15/15 | 28994934.2 | 19982205.382 | 85808417.508 | 158241379.881 | 188070599.775 | 285684320.015 |
| 1/16/15 | 31833499.9 | 7660387.717 | 9635668.224 | 11353173.937 | 11353173.937 | 14528333.173 |
| 1/17/15 | 33553731.78 | 13004899.341 | 56060917.674 | 114619931.21 | 186135746.224 | 240521359.296 |
| 1/18/15 | 33553731.78 | 21589878.251 | 47267811.713 | 92881050.817 | 198887971.132 | 229191290.328 |
| 1/19/15 | 33553731.78 | 23891947.284 | 23891947.284 | 68194644.761 | 128861790.746 | 203003556.402 |
| 1/20/15 | 31763527.71 | 21079747.795 | 82981175.628 | 98184219.392 | 135212205.837 | 237849368.975 |
| 1/21/15 | 27449715.72 | 17649096.068 | 93982230.754 | 93982230.754 | 121516999.158 | 248737108.655 |
| 1/22/15 | 26019722.44 | 1552282.958 | 1748034.801 | 6521645.208 | 9874635.175 | 12080233.991 |
| 1/23/15 | 23009016.29 | 17054402.47 | 83953344.649 | 138690607.91 | 138690607.91 | 183196907.393 |
| 1/24/15 | 19212037.64 | -507492.163 | 691435.401 | 859145.033 | 4894640.996 | 9233658.103 |
| 1/25/15 | 19212037.64 | 15629336.278 | 59754916.813 | 120636645.337 | 161503748.255 | 173277517.815 |
| 1/26/15 | 19212037.64 | 14480196.927 | 14480196.927 | 100526931.57 | 126997189.389 | 160039604.005 |
| 1/27/15 | 16957921.52 | 17161906.902 | 101973712.516 | 136447547.048 | 191857230.746 | 221762296.226 |
| 1/28/15 | 18447187.52 | 27471888.246 | 132731275.241 | 132731275.241 | 204367450.804 | 247114316.319 |
| 1/29/15 | 18633483.9 | 30415965.155 | 73706224.113 | 153386713.343 | 187265448.241 | 247399778.478 |
| 1/30/15 | 18616194.95 | 3321801.969 | 4480280.523 | 5771978.758 | 5771978.758 | 6255501.057 |
| 1/31/15 | 18283432.85 | 32659452.097 | 84580713.748 | 120889517.527 | 189151488.438 | 259915889.236 |
| 2/1/15 | 18283432.85 | 30372874.238 | 60342977.279 | 99887490.902 | 188975990.637 | 223011122.14 |
| 2/2/15 | 18283432.85 | 31421562.11 | 31421562.11 | 82321589.351 | 117874198.392 | 184693078.148 |
| 2/3/15 | 16401598.94 | 32262896.325 | 85331456.222 | 100654266.7 | 128864983.062 | 208115287.945 |
| 2/4/15 | 13658164.22 | 16036693.809 | 17063733.409 | 17063733.409 | 17292886.536 | 18962802.553 |
| 2/5/15 | 13996509.05 | 49121414.619 | 86347983.919 | 132096888.456 | 146581147.355 | 189992336.905 |
| 2/6/15 | 14613943.58 | 48654494.106 | 95037507.046 | 146735831.217 | 146735831.217 | 186560085.398 |
| 2/7/15 | 15483952.54 | 55327300.57 | 121836795.041 | 147197536.26 | 174224060.045 | 199977022.912 |
| 2/8/15 | 15483952.54 | 57211751.132 | 94528059.229 | 133989289.393 | 175507371.024 | 188706069.335 |
| 2/9/15 | 15483952.54 | 64814437.685 | 64814437.685 | 131051004.348 | 156217239.211 | 182976854.237 |
| 2/10/15 | 17931255.25 | 69663559.282 | 141668075.921 | 158442430.475 | 182833815.524 | 219508813.81 |
| 2/11/15 | 19423570.38 | 73786724.713 | 173938231.584 | 173938231.584 | 201605235.121 | 241447589.969 |
| 2/12/15 | 17769641.41 | 73399893.758 | 132186717.976 | 199309868.051 | 212797199.883 | 240483345.832 |
| 2/13/15 | 17183197.52 | 75036717.691 | 132112653.79 | 218231998.841 | 218231998.841 | 247710377.392 |
| 2/14/15 | 16285996.17 | 82649734.677 | 141035906.769 | 185123198.354 | 236578739.83 | 257766836.122 |
| 2/15/15 | 16285996.17 | 74607265.498 | 106702734.637 | 152468722.546 | 223821979.997 | 234493863.689 |
| 2/16/15 | 16285996.17 | 89255507.175 | 89255507.175 | 144541464.231 | 186124093.344 | 234607075.54 |
| 2/17/15 | 15683696.14 | 89194378.969 | 160521325.762 | 180082911.397 | 213677700.169 | 272659701.965 |
| 2/18/15 | 15809274.32 | 83262337.746 | 172802846.155 | 172802846.155 | 206302317.084 | 275324941.526 |
| 2/19/15 | 12239409.14 | 82350773.051 | 128106803.334 | 185089406.662 | 200832620.734 | 242186140.714 |
| 2/20/15 | 16877683.35 | 79244759.737 | 134139186.151 | 200543745.665 | 200543745.665 | 240172210.697 |
| 2/21/15 | 22221148.55 | 79772592.729 | 150890856.874 | 186462188.882 | 221935625.086 | 247814923.414 |
| 2/22/15 | 22221148.55 | 78819118.533 | 115894994.794 | 166392750.642 | 220982150.89 | 234724396.176 |
| 2/23/15 | 22221148.55 | 77428483.317 | 77428483.317 | 147542839.48 | 182589414.416 | 217630754.249 |
| 2/24/15 | 22474500.55 | 80525734.537 | 153877567.414 | 166888930.639 | 193129094.831 | 241497633.052 |
| 2/25/15 | 19434034.58 | 71300824.955 | 160025778.58 | 160025778.58 | 183868593.558 | 238813262.656 |
| 2/26/15 | 22813725.73 | 71430404.49 | 105437564.816 | 170169664.679 | 180625052.32 | 216235899.839 |
| 2/27/15 | 26922511.99 | 72041772.251 | 114717505.046 | 180410342.423 | 180410342.423 | 212610601.061 |
| 2/28/15 | 27840188.61 | 11893683.299 | 12266543.481 | 12479571.71 | 14688959.288 | 15031616.392 |